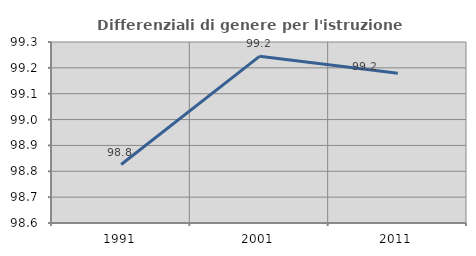
| Category | Differenziali di genere per l'istruzione superiore |
|---|---|
| 1991.0 | 98.826 |
| 2001.0 | 99.245 |
| 2011.0 | 99.179 |